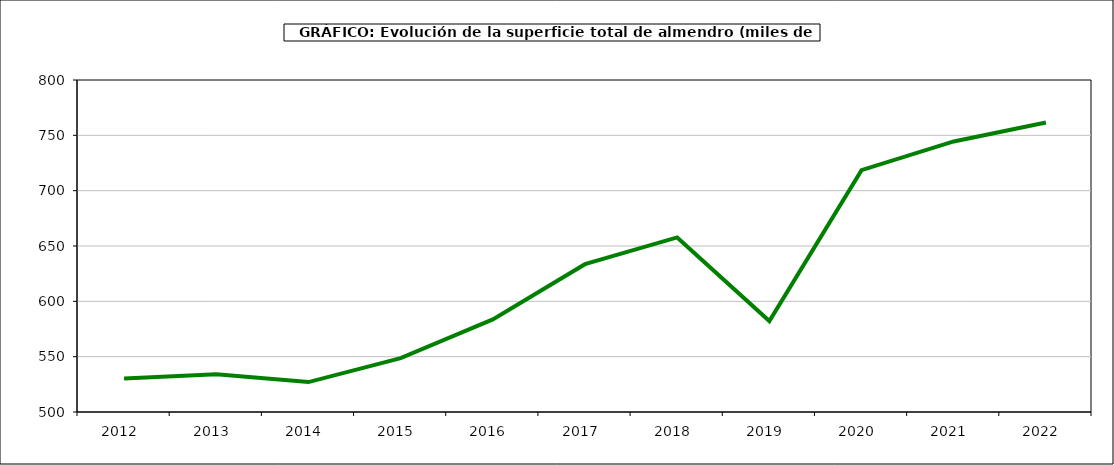
| Category | superficie almendro |
|---|---|
| 2012.0 | 530.223 |
| 2013.0 | 534.057 |
| 2014.0 | 527.029 |
| 2015.0 | 548.604 |
| 2016.0 | 583.673 |
| 2017.0 | 633.562 |
| 2018.0 | 657.768 |
| 2019.0 | 582.174 |
| 2020.0 | 718.54 |
| 2021.0 | 744.466 |
| 2022.0 | 761.662 |